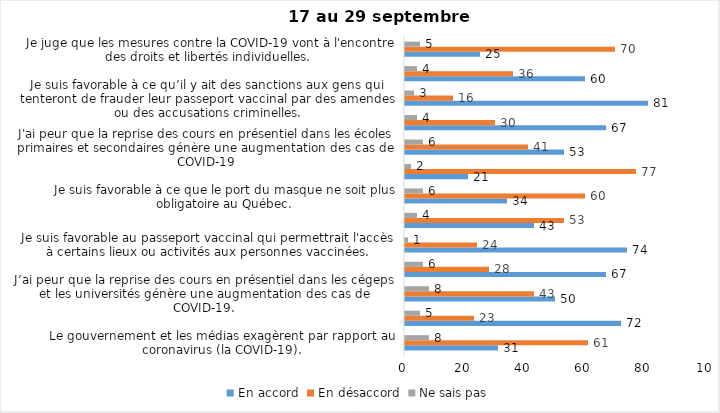
| Category | En accord | En désaccord | Ne sais pas |
|---|---|---|---|
| Le gouvernement et les médias exagèrent par rapport au coronavirus (la COVID-19). | 31 | 61 | 8 |
| J’ai peur que le système de santé soit débordé par les cas de COVID-19. | 72 | 23 | 5 |
| J’ai peur que la reprise des cours en présentiel dans les cégeps et les universités génère une augmentation des cas de COVID-19. | 50 | 43 | 8 |
| Je suis inquiet/inquiète  que le nombre de cas augmente en raison des nouveaux variants du virus de la COVID-19 | 67 | 28 | 6 |
| Je suis favorable au passeport vaccinal qui permettrait l'accès à certains lieux ou activités aux personnes vaccinées. | 74 | 24 | 1 |
| Si les cas de COVID-19 augmentent cet automne, je suis favorable à la mise en place de mesures de confinement (ex. fermeture de services non essentiels, interdiction des rassemblements privés) | 43 | 53 | 4 |
| Je suis favorable à ce que le port du masque ne soit plus obligatoire au Québec. | 34 | 60 | 6 |
| Étant donné la progression de la vaccination, je pense qu’il est moins important de suivre les mesures de prévention. | 21 | 77 | 2 |
| J'ai peur que la reprise des cours en présentiel dans les écoles primaires et secondaires génère une augmentation des cas de COVID-19 | 53 | 41 | 6 |
| Je suis favorable à ce qu’il y ait des sanctions aux commerçants qui ne vérifieront pas le passeport vaccinal (code QR) de leurs clients | 67 | 30 | 4 |
| Je suis favorable à ce qu’il y ait des sanctions aux gens qui tenteront de frauder leur passeport vaccinal par des amendes ou des accusations criminelles. | 81 | 16 | 3 |
| Je crois que le passeport vaccinal devrait être requis pour davantage de services et commerces (ex. : spas, centre d’achats, centre de soins personnels. | 60 | 36 | 4 |
| Je juge que les mesures contre la COVID-19 vont à l'encontre des droits et libertés individuelles.  | 25 | 70 | 5 |